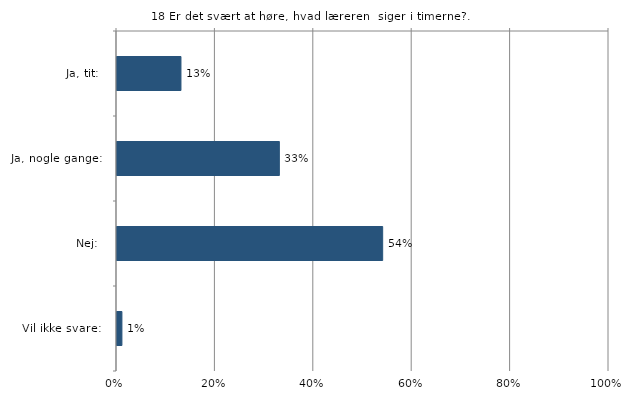
| Category | Er det svært at høre, hvad læreren  siger i timerne? |
|---|---|
| Ja, tit:   | 0.13 |
| Ja, nogle gange:   | 0.33 |
| Nej:   | 0.54 |
| Vil ikke svare:   | 0.01 |